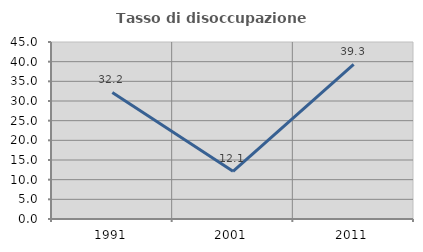
| Category | Tasso di disoccupazione giovanile  |
|---|---|
| 1991.0 | 32.168 |
| 2001.0 | 12.121 |
| 2011.0 | 39.286 |